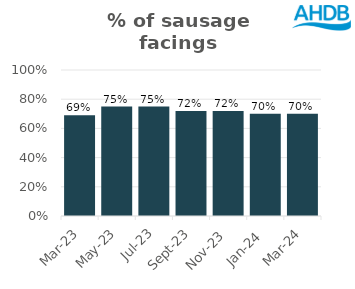
| Category | Sausage |
|---|---|
| 2023-03-01 | 0.69 |
| 2023-05-01 | 0.75 |
| 2023-07-01 | 0.75 |
| 2023-09-01 | 0.72 |
| 2023-11-01 | 0.72 |
| 2024-01-01 | 0.7 |
| 2024-03-01 | 0.7 |